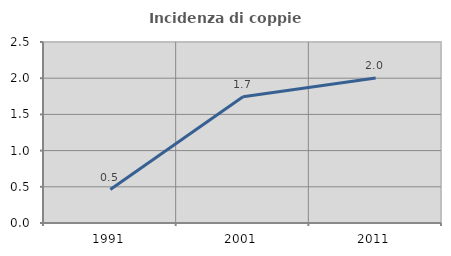
| Category | Incidenza di coppie miste |
|---|---|
| 1991.0 | 0.462 |
| 2001.0 | 1.743 |
| 2011.0 | 2.003 |